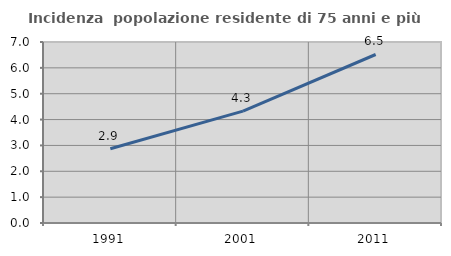
| Category | Incidenza  popolazione residente di 75 anni e più |
|---|---|
| 1991.0 | 2.87 |
| 2001.0 | 4.327 |
| 2011.0 | 6.517 |